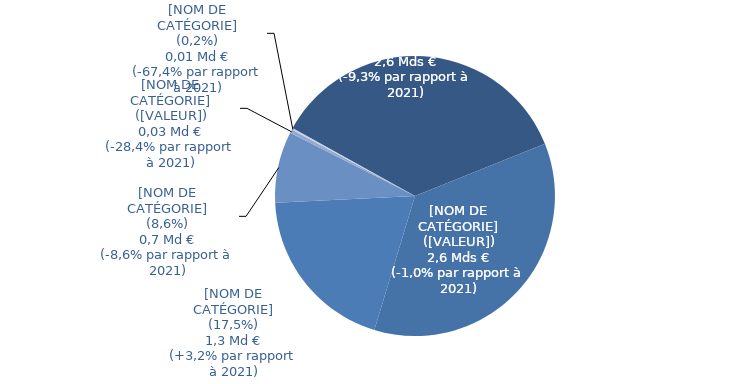
| Category | Series 0 |
|---|---|
| ITAF | 0.359 |
| Contributions Régime général | 0 |
| Compensation démographique | 0.358 |
| Cotisations sociales | 0.195 |
| Autres produits** | 0.082 |
| Prise en charge de prestations* | 0.004 |
| Contribution Sociale Généralisée | 0 |
| Cotisations prises en charge par l'Etat | 0.002 |